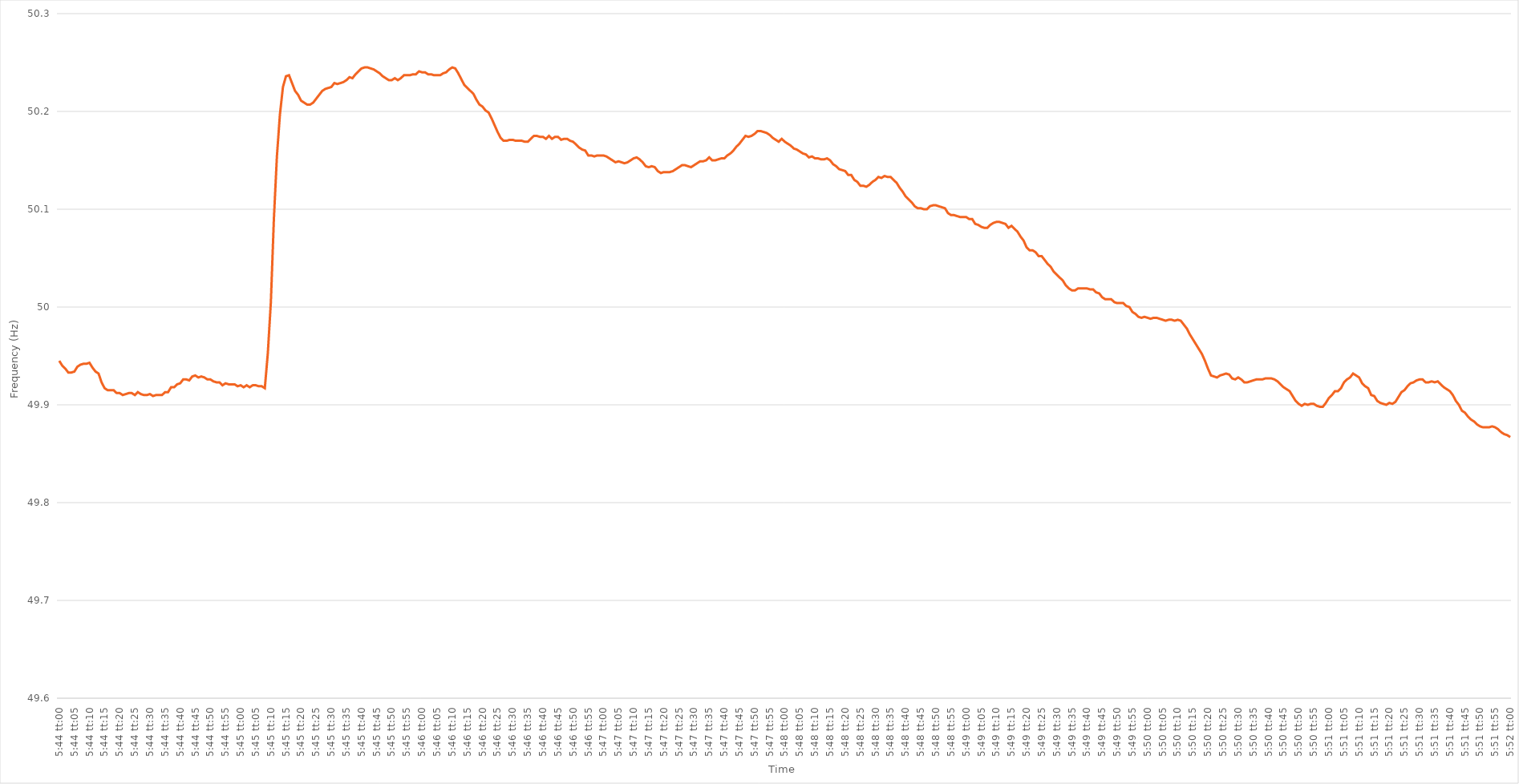
| Category | Series 0 |
|---|---|
| 0.2388888888888889 | 49.945 |
| 0.23890046296296297 | 49.94 |
| 0.23891203703703703 | 49.937 |
| 0.23892361111111113 | 49.933 |
| 0.2389351851851852 | 49.933 |
| 0.23894675925925926 | 49.934 |
| 0.23895833333333336 | 49.939 |
| 0.23896990740740742 | 49.941 |
| 0.23898148148148146 | 49.942 |
| 0.23899305555555558 | 49.942 |
| 0.23900462962962962 | 49.943 |
| 0.2390162037037037 | 49.938 |
| 0.23902777777777776 | 49.934 |
| 0.23903935185185185 | 49.932 |
| 0.23905092592592592 | 49.923 |
| 0.23906249999999998 | 49.917 |
| 0.23907407407407408 | 49.915 |
| 0.23908564814814814 | 49.915 |
| 0.2390972222222222 | 49.915 |
| 0.2391087962962963 | 49.912 |
| 0.23912037037037037 | 49.912 |
| 0.23913194444444444 | 49.91 |
| 0.23914351851851853 | 49.911 |
| 0.2391550925925926 | 49.912 |
| 0.23916666666666667 | 49.912 |
| 0.23917824074074076 | 49.91 |
| 0.23918981481481483 | 49.913 |
| 0.2392013888888889 | 49.911 |
| 0.239212962962963 | 49.91 |
| 0.23922453703703703 | 49.91 |
| 0.23923611111111112 | 49.911 |
| 0.23924768518518516 | 49.909 |
| 0.23925925925925925 | 49.91 |
| 0.23927083333333332 | 49.91 |
| 0.2392824074074074 | 49.91 |
| 0.23929398148148148 | 49.913 |
| 0.23930555555555555 | 49.913 |
| 0.23931712962962962 | 49.918 |
| 0.2393287037037037 | 49.918 |
| 0.23934027777777778 | 49.921 |
| 0.23935185185185184 | 49.922 |
| 0.23936342592592594 | 49.926 |
| 0.239375 | 49.926 |
| 0.23938657407407407 | 49.925 |
| 0.23939814814814817 | 49.929 |
| 0.23940972222222223 | 49.93 |
| 0.2394212962962963 | 49.928 |
| 0.2394328703703704 | 49.929 |
| 0.23944444444444443 | 49.928 |
| 0.23945601851851853 | 49.926 |
| 0.23946759259259257 | 49.926 |
| 0.2394791666666667 | 49.924 |
| 0.23949074074074073 | 49.923 |
| 0.2395023148148148 | 49.923 |
| 0.2395138888888889 | 49.92 |
| 0.23952546296296295 | 49.922 |
| 0.23953703703703702 | 49.921 |
| 0.23954861111111111 | 49.921 |
| 0.23956018518518518 | 49.921 |
| 0.23957175925925925 | 49.919 |
| 0.23958333333333334 | 49.92 |
| 0.2395949074074074 | 49.918 |
| 0.23960648148148148 | 49.92 |
| 0.23961805555555557 | 49.918 |
| 0.23962962962962964 | 49.92 |
| 0.2396412037037037 | 49.92 |
| 0.2396527777777778 | 49.919 |
| 0.23966435185185186 | 49.919 |
| 0.23967592592592593 | 49.917 |
| 0.23968749999999997 | 49.953 |
| 0.2396990740740741 | 50.005 |
| 0.23971064814814813 | 50.09 |
| 0.23972222222222225 | 50.154 |
| 0.2397337962962963 | 50.197 |
| 0.23974537037037036 | 50.225 |
| 0.23975694444444443 | 50.236 |
| 0.23976851851851852 | 50.237 |
| 0.2397800925925926 | 50.229 |
| 0.23979166666666665 | 50.221 |
| 0.23980324074074075 | 50.217 |
| 0.23981481481481481 | 50.211 |
| 0.23982638888888888 | 50.209 |
| 0.23983796296296298 | 50.207 |
| 0.23984953703703704 | 50.207 |
| 0.2398611111111111 | 50.209 |
| 0.2398726851851852 | 50.213 |
| 0.23988425925925927 | 50.217 |
| 0.23989583333333334 | 50.221 |
| 0.23990740740740743 | 50.223 |
| 0.2399189814814815 | 50.224 |
| 0.23993055555555554 | 50.225 |
| 0.23994212962962966 | 50.229 |
| 0.2399537037037037 | 50.228 |
| 0.23996527777777776 | 50.229 |
| 0.23997685185185183 | 50.23 |
| 0.23998842592592592 | 50.232 |
| 0.24 | 50.235 |
| 0.24001157407407406 | 50.234 |
| 0.24002314814814815 | 50.238 |
| 0.24003472222222222 | 50.241 |
| 0.24004629629629629 | 50.244 |
| 0.24005787037037038 | 50.245 |
| 0.24006944444444445 | 50.245 |
| 0.2400810185185185 | 50.244 |
| 0.2400925925925926 | 50.243 |
| 0.24010416666666667 | 50.241 |
| 0.24011574074074074 | 50.239 |
| 0.24012731481481484 | 50.236 |
| 0.2401388888888889 | 50.234 |
| 0.24015046296296297 | 50.232 |
| 0.24016203703703706 | 50.232 |
| 0.2401736111111111 | 50.234 |
| 0.2401851851851852 | 50.232 |
| 0.24019675925925923 | 50.234 |
| 0.24020833333333333 | 50.237 |
| 0.2402199074074074 | 50.237 |
| 0.24023148148148146 | 50.237 |
| 0.24024305555555556 | 50.238 |
| 0.24025462962962962 | 50.238 |
| 0.2402662037037037 | 50.241 |
| 0.24027777777777778 | 50.24 |
| 0.24028935185185185 | 50.24 |
| 0.24030092592592592 | 50.238 |
| 0.2403125 | 50.238 |
| 0.24032407407407408 | 50.237 |
| 0.24033564814814815 | 50.237 |
| 0.24034722222222224 | 50.237 |
| 0.2403587962962963 | 50.239 |
| 0.24037037037037037 | 50.24 |
| 0.24038194444444447 | 50.243 |
| 0.2403935185185185 | 50.245 |
| 0.2404050925925926 | 50.244 |
| 0.24041666666666664 | 50.239 |
| 0.24042824074074076 | 50.233 |
| 0.2404398148148148 | 50.227 |
| 0.24045138888888887 | 50.224 |
| 0.24046296296296296 | 50.221 |
| 0.24047453703703703 | 50.218 |
| 0.2404861111111111 | 50.212 |
| 0.2404976851851852 | 50.207 |
| 0.24050925925925926 | 50.205 |
| 0.24052083333333332 | 50.201 |
| 0.24053240740740742 | 50.199 |
| 0.24054398148148148 | 50.193 |
| 0.24055555555555555 | 50.186 |
| 0.24056712962962964 | 50.179 |
| 0.2405787037037037 | 50.173 |
| 0.24059027777777778 | 50.17 |
| 0.24060185185185187 | 50.17 |
| 0.24061342592592594 | 50.171 |
| 0.240625 | 50.171 |
| 0.24063657407407404 | 50.17 |
| 0.24064814814814817 | 50.17 |
| 0.2406597222222222 | 50.17 |
| 0.24067129629629633 | 50.169 |
| 0.24068287037037037 | 50.169 |
| 0.24069444444444443 | 50.172 |
| 0.2407060185185185 | 50.175 |
| 0.2407175925925926 | 50.175 |
| 0.24072916666666666 | 50.174 |
| 0.24074074074074073 | 50.174 |
| 0.24075231481481482 | 50.172 |
| 0.2407638888888889 | 50.175 |
| 0.24077546296296296 | 50.172 |
| 0.24078703703703705 | 50.174 |
| 0.24079861111111112 | 50.174 |
| 0.24081018518518518 | 50.171 |
| 0.24082175925925928 | 50.172 |
| 0.24083333333333334 | 50.172 |
| 0.2408449074074074 | 50.17 |
| 0.2408564814814815 | 50.169 |
| 0.24086805555555557 | 50.166 |
| 0.2408796296296296 | 50.163 |
| 0.24089120370370373 | 50.161 |
| 0.24090277777777777 | 50.16 |
| 0.24091435185185184 | 50.155 |
| 0.2409259259259259 | 50.155 |
| 0.2409375 | 50.154 |
| 0.24094907407407407 | 50.155 |
| 0.24096064814814813 | 50.155 |
| 0.24097222222222223 | 50.155 |
| 0.2409837962962963 | 50.154 |
| 0.24099537037037036 | 50.152 |
| 0.24100694444444445 | 50.15 |
| 0.24101851851851852 | 50.148 |
| 0.2410300925925926 | 50.149 |
| 0.24104166666666668 | 50.148 |
| 0.24105324074074075 | 50.147 |
| 0.24106481481481482 | 50.148 |
| 0.2410763888888889 | 50.15 |
| 0.24108796296296298 | 50.152 |
| 0.24109953703703701 | 50.153 |
| 0.24111111111111114 | 50.151 |
| 0.24112268518518518 | 50.148 |
| 0.24113425925925927 | 50.144 |
| 0.2411458333333333 | 50.143 |
| 0.2411574074074074 | 50.144 |
| 0.24116898148148147 | 50.143 |
| 0.24118055555555554 | 50.139 |
| 0.24119212962962963 | 50.137 |
| 0.2412037037037037 | 50.138 |
| 0.24121527777777776 | 50.138 |
| 0.24122685185185186 | 50.138 |
| 0.24123842592592593 | 50.139 |
| 0.24125 | 50.141 |
| 0.2412615740740741 | 50.143 |
| 0.24127314814814815 | 50.145 |
| 0.24128472222222222 | 50.145 |
| 0.24129629629629631 | 50.144 |
| 0.24130787037037038 | 50.143 |
| 0.24131944444444445 | 50.145 |
| 0.24133101851851854 | 50.147 |
| 0.24134259259259258 | 50.149 |
| 0.24135416666666668 | 50.149 |
| 0.24136574074074071 | 50.15 |
| 0.24137731481481484 | 50.153 |
| 0.24138888888888888 | 50.15 |
| 0.24140046296296294 | 50.15 |
| 0.24141203703703704 | 50.151 |
| 0.2414236111111111 | 50.152 |
| 0.24143518518518517 | 50.152 |
| 0.24144675925925926 | 50.155 |
| 0.24145833333333333 | 50.157 |
| 0.2414699074074074 | 50.16 |
| 0.2414814814814815 | 50.164 |
| 0.24149305555555556 | 50.167 |
| 0.24150462962962962 | 50.171 |
| 0.24151620370370372 | 50.175 |
| 0.24152777777777779 | 50.174 |
| 0.24153935185185185 | 50.175 |
| 0.24155092592592595 | 50.177 |
| 0.2415625 | 50.18 |
| 0.24157407407407408 | 50.18 |
| 0.24158564814814812 | 50.179 |
| 0.24159722222222224 | 50.178 |
| 0.24160879629629628 | 50.176 |
| 0.24162037037037035 | 50.173 |
| 0.24163194444444444 | 50.171 |
| 0.2416435185185185 | 50.169 |
| 0.24165509259259257 | 50.172 |
| 0.24166666666666667 | 50.169 |
| 0.24167824074074074 | 50.167 |
| 0.2416898148148148 | 50.165 |
| 0.2417013888888889 | 50.162 |
| 0.24171296296296296 | 50.161 |
| 0.24172453703703703 | 50.159 |
| 0.24173611111111112 | 50.157 |
| 0.2417476851851852 | 50.156 |
| 0.24175925925925926 | 50.153 |
| 0.24177083333333335 | 50.154 |
| 0.24178240740740742 | 50.152 |
| 0.24179398148148148 | 50.152 |
| 0.24180555555555558 | 50.151 |
| 0.24181712962962965 | 50.151 |
| 0.24182870370370368 | 50.152 |
| 0.2418402777777778 | 50.15 |
| 0.24185185185185185 | 50.146 |
| 0.2418634259259259 | 50.144 |
| 0.24187499999999998 | 50.141 |
| 0.24188657407407407 | 50.14 |
| 0.24189814814814814 | 50.139 |
| 0.2419097222222222 | 50.135 |
| 0.2419212962962963 | 50.135 |
| 0.24193287037037037 | 50.13 |
| 0.24194444444444443 | 50.128 |
| 0.24195601851851853 | 50.124 |
| 0.2419675925925926 | 50.124 |
| 0.24197916666666666 | 50.123 |
| 0.24199074074074076 | 50.125 |
| 0.24200231481481482 | 50.128 |
| 0.2420138888888889 | 50.13 |
| 0.24202546296296298 | 50.133 |
| 0.24203703703703705 | 50.132 |
| 0.2420486111111111 | 50.134 |
| 0.2420601851851852 | 50.133 |
| 0.24207175925925925 | 50.133 |
| 0.24208333333333334 | 50.13 |
| 0.24209490740740738 | 50.127 |
| 0.24210648148148148 | 50.122 |
| 0.24211805555555554 | 50.118 |
| 0.2421296296296296 | 50.113 |
| 0.2421412037037037 | 50.11 |
| 0.24215277777777777 | 50.107 |
| 0.24216435185185184 | 50.103 |
| 0.24217592592592593 | 50.101 |
| 0.2421875 | 50.101 |
| 0.24219907407407407 | 50.1 |
| 0.24221064814814816 | 50.1 |
| 0.24222222222222223 | 50.103 |
| 0.2422337962962963 | 50.104 |
| 0.2422453703703704 | 50.104 |
| 0.24225694444444446 | 50.103 |
| 0.24226851851851852 | 50.102 |
| 0.24228009259259262 | 50.101 |
| 0.24229166666666666 | 50.096 |
| 0.24230324074074075 | 50.094 |
| 0.2423148148148148 | 50.094 |
| 0.2423263888888889 | 50.093 |
| 0.24233796296296295 | 50.092 |
| 0.24234953703703702 | 50.092 |
| 0.2423611111111111 | 50.092 |
| 0.24237268518518518 | 50.09 |
| 0.24238425925925924 | 50.09 |
| 0.24239583333333334 | 50.085 |
| 0.2424074074074074 | 50.084 |
| 0.24241898148148147 | 50.082 |
| 0.24243055555555557 | 50.081 |
| 0.24244212962962963 | 50.081 |
| 0.2424537037037037 | 50.084 |
| 0.2424652777777778 | 50.086 |
| 0.24247685185185186 | 50.087 |
| 0.24248842592592593 | 50.087 |
| 0.24250000000000002 | 50.086 |
| 0.2425115740740741 | 50.085 |
| 0.24252314814814815 | 50.081 |
| 0.2425347222222222 | 50.083 |
| 0.24254629629629632 | 50.08 |
| 0.24255787037037035 | 50.077 |
| 0.24256944444444442 | 50.072 |
| 0.24258101851851852 | 50.068 |
| 0.24259259259259258 | 50.061 |
| 0.24260416666666665 | 50.058 |
| 0.24261574074074074 | 50.058 |
| 0.2426273148148148 | 50.056 |
| 0.24263888888888888 | 50.052 |
| 0.24265046296296297 | 50.052 |
| 0.24266203703703704 | 50.048 |
| 0.2426736111111111 | 50.044 |
| 0.2426851851851852 | 50.041 |
| 0.24269675925925926 | 50.036 |
| 0.24270833333333333 | 50.033 |
| 0.24271990740740743 | 50.03 |
| 0.2427314814814815 | 50.027 |
| 0.24274305555555556 | 50.022 |
| 0.24275462962962965 | 50.019 |
| 0.24276620370370372 | 50.017 |
| 0.24277777777777776 | 50.017 |
| 0.24278935185185188 | 50.019 |
| 0.24280092592592592 | 50.019 |
| 0.2428125 | 50.019 |
| 0.24282407407407405 | 50.019 |
| 0.24283564814814815 | 50.018 |
| 0.24284722222222221 | 50.018 |
| 0.24285879629629628 | 50.015 |
| 0.24287037037037038 | 50.014 |
| 0.24288194444444444 | 50.01 |
| 0.2428935185185185 | 50.008 |
| 0.2429050925925926 | 50.008 |
| 0.24291666666666667 | 50.008 |
| 0.24292824074074074 | 50.005 |
| 0.24293981481481483 | 50.004 |
| 0.2429513888888889 | 50.004 |
| 0.24296296296296296 | 50.004 |
| 0.24297453703703706 | 50.001 |
| 0.24298611111111112 | 50 |
| 0.24299768518518516 | 49.995 |
| 0.24300925925925929 | 49.993 |
| 0.24302083333333332 | 49.99 |
| 0.24303240740740742 | 49.989 |
| 0.24304398148148146 | 49.99 |
| 0.24305555555555555 | 49.989 |
| 0.24306712962962962 | 49.988 |
| 0.24307870370370369 | 49.989 |
| 0.24309027777777778 | 49.989 |
| 0.24310185185185185 | 49.988 |
| 0.2431134259259259 | 49.987 |
| 0.243125 | 49.986 |
| 0.24313657407407407 | 49.987 |
| 0.24314814814814814 | 49.987 |
| 0.24315972222222224 | 49.986 |
| 0.2431712962962963 | 49.987 |
| 0.24318287037037037 | 49.986 |
| 0.24319444444444446 | 49.982 |
| 0.24320601851851853 | 49.978 |
| 0.2432175925925926 | 49.972 |
| 0.2432291666666667 | 49.967 |
| 0.24324074074074073 | 49.962 |
| 0.24325231481481482 | 49.957 |
| 0.24326388888888886 | 49.952 |
| 0.24327546296296299 | 49.945 |
| 0.24328703703703702 | 49.937 |
| 0.2432986111111111 | 49.93 |
| 0.24331018518518518 | 49.929 |
| 0.24332175925925925 | 49.928 |
| 0.24333333333333332 | 49.93 |
| 0.2433449074074074 | 49.931 |
| 0.24335648148148148 | 49.932 |
| 0.24336805555555555 | 49.931 |
| 0.24337962962962964 | 49.927 |
| 0.2433912037037037 | 49.926 |
| 0.24340277777777777 | 49.928 |
| 0.24341435185185187 | 49.926 |
| 0.24342592592592593 | 49.923 |
| 0.2434375 | 49.923 |
| 0.2434490740740741 | 49.924 |
| 0.24346064814814816 | 49.925 |
| 0.24347222222222223 | 49.926 |
| 0.24348379629629627 | 49.926 |
| 0.2434953703703704 | 49.926 |
| 0.24350694444444443 | 49.927 |
| 0.2435185185185185 | 49.927 |
| 0.2435300925925926 | 49.927 |
| 0.24354166666666666 | 49.926 |
| 0.24355324074074072 | 49.924 |
| 0.24356481481481482 | 49.921 |
| 0.24357638888888888 | 49.918 |
| 0.24358796296296295 | 49.916 |
| 0.24359953703703704 | 49.914 |
| 0.2436111111111111 | 49.909 |
| 0.24362268518518518 | 49.904 |
| 0.24363425925925927 | 49.901 |
| 0.24364583333333334 | 49.899 |
| 0.2436574074074074 | 49.901 |
| 0.2436689814814815 | 49.9 |
| 0.24368055555555557 | 49.901 |
| 0.24369212962962963 | 49.901 |
| 0.24370370370370367 | 49.899 |
| 0.2437152777777778 | 49.898 |
| 0.24372685185185183 | 49.898 |
| 0.24373842592592596 | 49.902 |
| 0.24375 | 49.907 |
| 0.24376157407407406 | 49.91 |
| 0.24377314814814813 | 49.914 |
| 0.24378472222222222 | 49.914 |
| 0.2437962962962963 | 49.917 |
| 0.24380787037037036 | 49.923 |
| 0.24381944444444445 | 49.926 |
| 0.24383101851851852 | 49.928 |
| 0.24384259259259258 | 49.932 |
| 0.24385416666666668 | 49.93 |
| 0.24386574074074074 | 49.928 |
| 0.2438773148148148 | 49.922 |
| 0.2438888888888889 | 49.919 |
| 0.24390046296296297 | 49.917 |
| 0.24391203703703704 | 49.91 |
| 0.24392361111111113 | 49.909 |
| 0.2439351851851852 | 49.904 |
| 0.24394675925925924 | 49.902 |
| 0.24395833333333336 | 49.901 |
| 0.2439699074074074 | 49.9 |
| 0.2439814814814815 | 49.902 |
| 0.24399305555555553 | 49.901 |
| 0.24400462962962963 | 49.903 |
| 0.2440162037037037 | 49.908 |
| 0.24402777777777776 | 49.913 |
| 0.24403935185185185 | 49.915 |
| 0.24405092592592592 | 49.919 |
| 0.2440625 | 49.922 |
| 0.24407407407407408 | 49.923 |
| 0.24408564814814815 | 49.925 |
| 0.24409722222222222 | 49.926 |
| 0.2441087962962963 | 49.926 |
| 0.24412037037037038 | 49.923 |
| 0.24413194444444444 | 49.923 |
| 0.24414351851851854 | 49.924 |
| 0.2441550925925926 | 49.923 |
| 0.24416666666666667 | 49.924 |
| 0.24417824074074077 | 49.921 |
| 0.2441898148148148 | 49.918 |
| 0.2442013888888889 | 49.916 |
| 0.24421296296296294 | 49.914 |
| 0.24422453703703703 | 49.91 |
| 0.2442361111111111 | 49.904 |
| 0.24424768518518516 | 49.9 |
| 0.24425925925925926 | 49.894 |
| 0.24427083333333333 | 49.892 |
| 0.2442824074074074 | 49.888 |
| 0.2442939814814815 | 49.885 |
| 0.24430555555555555 | 49.883 |
| 0.24431712962962962 | 49.88 |
| 0.24432870370370371 | 49.878 |
| 0.24434027777777778 | 49.877 |
| 0.24435185185185185 | 49.877 |
| 0.24436342592592594 | 49.877 |
| 0.244375 | 49.878 |
| 0.24438657407407408 | 49.877 |
| 0.24439814814814817 | 49.875 |
| 0.24440972222222224 | 49.872 |
| 0.2444212962962963 | 49.87 |
| 0.24443287037037034 | 49.869 |
| 0.24444444444444446 | 49.867 |